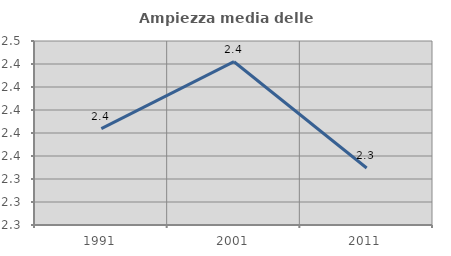
| Category | Ampiezza media delle famiglie |
|---|---|
| 1991.0 | 2.384 |
| 2001.0 | 2.442 |
| 2011.0 | 2.35 |